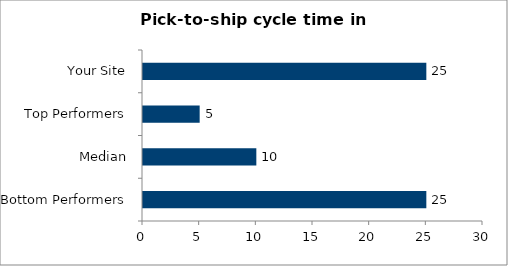
| Category | Series 0 |
|---|---|
| Bottom Performers | 25 |
| Median | 10 |
| Top Performers | 5 |
| Your Site | 25 |